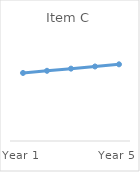
| Category | Item C |
|---|---|
| Year 1 | 0.63 |
| Year 2 | 0.65 |
| Year 3 | 0.67 |
| Year 4 | 0.69 |
| Year 5 | 0.71 |